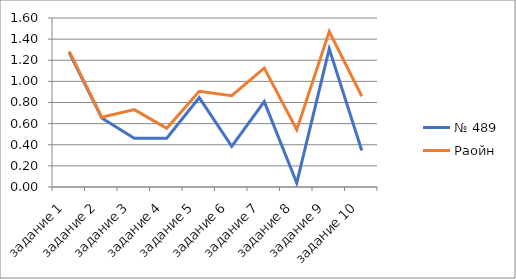
| Category | № 489 | Раойн |
|---|---|---|
| задание 1 | 1.269 | 1.284 |
| задание 2 | 0.654 | 0.661 |
| задание 3 | 0.462 | 0.733 |
| задание 4 | 0.462 | 0.555 |
| задание 5 | 0.846 | 0.906 |
| задание 6 | 0.385 | 0.865 |
| задание 7 | 0.808 | 1.127 |
| задание 8 | 0.038 | 0.543 |
| задание 9 | 1.308 | 1.472 |
| задание 10 | 0.346 | 0.859 |